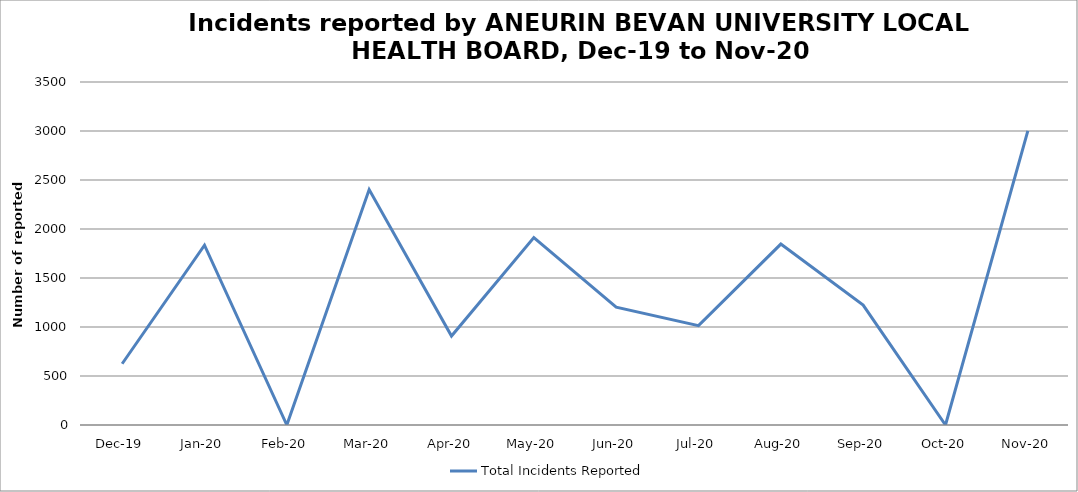
| Category | Total Incidents Reported |
|---|---|
| Dec-19 | 625 |
| Jan-20 | 1835 |
| Feb-20 | 0 |
| Mar-20 | 2402 |
| Apr-20 | 908 |
| May-20 | 1913 |
| Jun-20 | 1202 |
| Jul-20 | 1014 |
| Aug-20 | 1846 |
| Sep-20 | 1224 |
| Oct-20 | 0 |
| Nov-20 | 3001 |